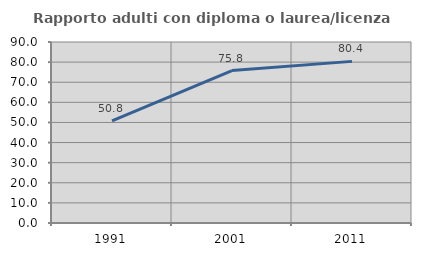
| Category | Rapporto adulti con diploma o laurea/licenza media  |
|---|---|
| 1991.0 | 50.794 |
| 2001.0 | 75.781 |
| 2011.0 | 80.368 |